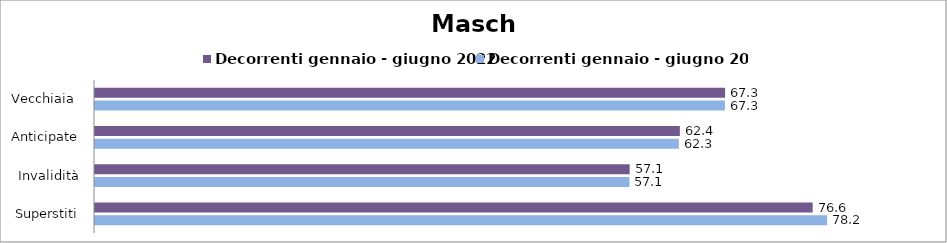
| Category | Decorrenti gennaio - giugno 2022 | Decorrenti gennaio - giugno 2023 |
|---|---|---|
| Vecchiaia  | 67.27 | 67.25 |
| Anticipate | 62.44 | 62.33 |
| Invalidità | 57.08 | 57.06 |
| Superstiti | 76.62 | 78.16 |